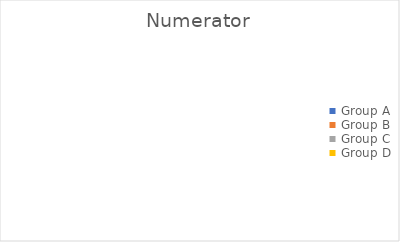
| Category | Numerator |
|---|---|
| Group A | 0 |
| Group B | 0 |
| Group C | 0 |
| Group D | 0 |